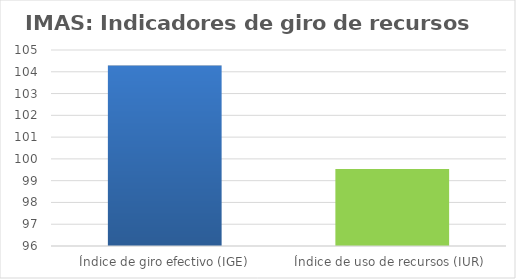
| Category | Series 0 |
|---|---|
| Índice de giro efectivo (IGE) | 104.287 |
| Índice de uso de recursos (IUR)  | 99.541 |